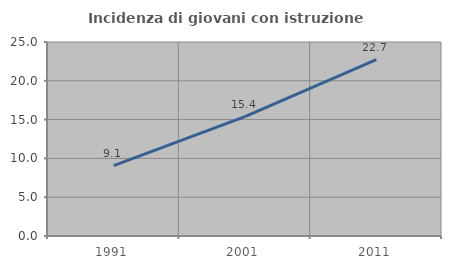
| Category | Incidenza di giovani con istruzione universitaria |
|---|---|
| 1991.0 | 9.071 |
| 2001.0 | 15.392 |
| 2011.0 | 22.721 |